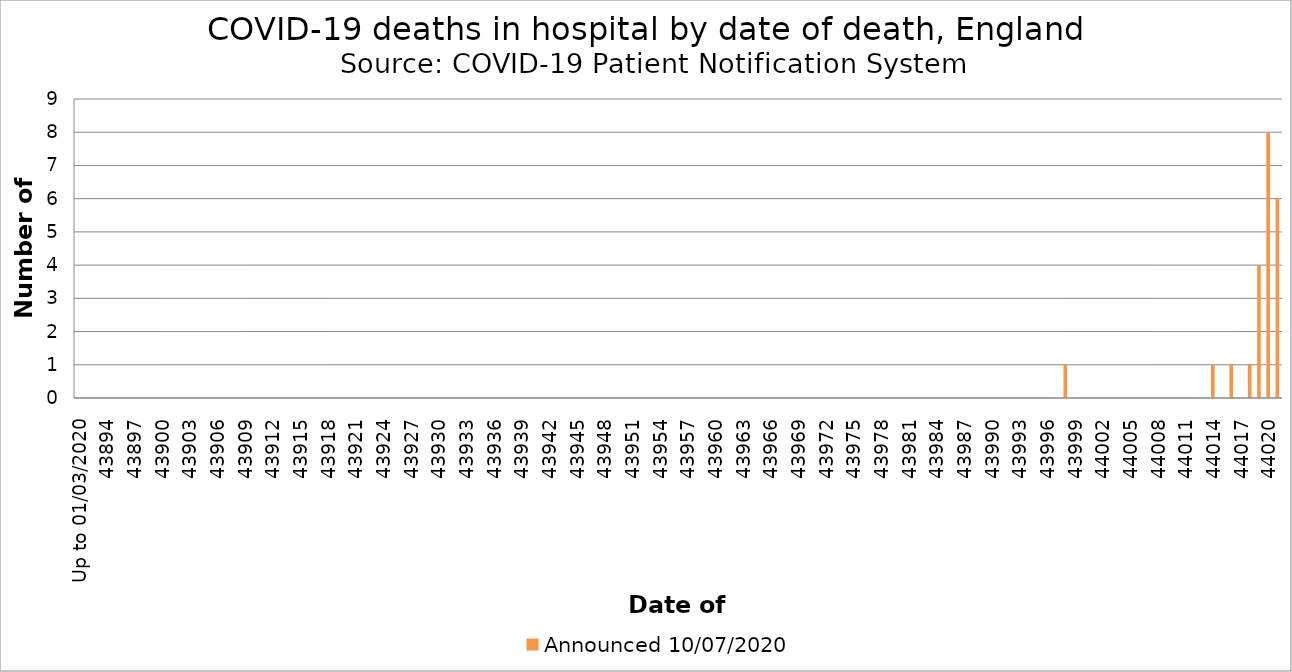
| Category | Announced 10/07/2020 |
|---|---|
| Up to 01/03/2020 | 0 |
| 02/03/2020 | 0 |
| 03/03/2020 | 0 |
| 04/03/2020 | 0 |
| 05/03/2020 | 0 |
| 06/03/2020 | 0 |
| 07/03/2020 | 0 |
| 08/03/2020 | 0 |
| 09/03/2020 | 0 |
| 10/03/2020 | 0 |
| 11/03/2020 | 0 |
| 12/03/2020 | 0 |
| 13/03/2020 | 0 |
| 14/03/2020 | 0 |
| 15/03/2020 | 0 |
| 16/03/2020 | 0 |
| 17/03/2020 | 0 |
| 18/03/2020 | 0 |
| 19/03/2020 | 0 |
| 20/03/2020 | 0 |
| 21/03/2020 | 0 |
| 22/03/2020 | 0 |
| 23/03/2020 | 0 |
| 24/03/2020 | 0 |
| 25/03/2020 | 0 |
| 26/03/2020 | 0 |
| 27/03/2020 | 0 |
| 28/03/2020 | 0 |
| 29/03/2020 | 0 |
| 30/03/2020 | 0 |
| 31/03/2020 | 0 |
| 01/04/2020 | 0 |
| 02/04/2020 | 0 |
| 03/04/2020 | 0 |
| 04/04/2020 | 0 |
| 05/04/2020 | 0 |
| 06/04/2020 | 0 |
| 07/04/2020 | 0 |
| 08/04/2020 | 0 |
| 09/04/2020 | 0 |
| 10/04/2020 | 0 |
| 11/04/2020 | 0 |
| 12/04/2020 | 0 |
| 13/04/2020 | 0 |
| 14/04/2020 | 0 |
| 15/04/2020 | 0 |
| 16/04/2020 | 0 |
| 17/04/2020 | 0 |
| 18/04/2020 | 0 |
| 19/04/2020 | 0 |
| 20/04/2020 | 0 |
| 21/04/2020 | 0 |
| 22/04/2020 | 0 |
| 23/04/2020 | 0 |
| 24/04/2020 | 0 |
| 25/04/2020 | 0 |
| 26/04/2020 | 0 |
| 27/04/2020 | 0 |
| 28/04/2020 | 0 |
| 29/04/2020 | 0 |
| 30/04/2020 | 0 |
| 01/05/2020 | 0 |
| 02/05/2020 | 0 |
| 03/05/2020 | 0 |
| 04/05/2020 | 0 |
| 05/05/2020 | 0 |
| 06/05/2020 | 0 |
| 07/05/2020 | 0 |
| 08/05/2020 | 0 |
| 09/05/2020 | 0 |
| 10/05/2020 | 0 |
| 11/05/2020 | 0 |
| 12/05/2020 | 0 |
| 13/05/2020 | 0 |
| 14/05/2020 | 0 |
| 15/05/2020 | 0 |
| 16/05/2020 | 0 |
| 17/05/2020 | 0 |
| 18/05/2020 | 0 |
| 19/05/2020 | 0 |
| 20/05/2020 | 0 |
| 21/05/2020 | 0 |
| 22/05/2020 | 0 |
| 23/05/2020 | 0 |
| 24/05/2020 | 0 |
| 25/05/2020 | 0 |
| 26/05/2020 | 0 |
| 27/05/2020 | 0 |
| 28/05/2020 | 0 |
| 29/05/2020 | 0 |
| 30/05/2020 | 0 |
| 31/05/2020 | 0 |
| 01/06/2020 | 0 |
| 02/06/2020 | 0 |
| 03/06/2020 | 0 |
| 04/06/2020 | 0 |
| 05/06/2020 | 0 |
| 06/06/2020 | 0 |
| 07/06/2020 | 0 |
| 08/06/2020 | 0 |
| 09/06/2020 | 0 |
| 10/06/2020 | 0 |
| 11/06/2020 | 0 |
| 12/06/2020 | 0 |
| 13/06/2020 | 0 |
| 14/06/2020 | 0 |
| 15/06/2020 | 0 |
| 16/06/2020 | 1 |
| 17/06/2020 | 0 |
| 18/06/2020 | 0 |
| 19/06/2020 | 0 |
| 20/06/2020 | 0 |
| 21/06/2020 | 0 |
| 22/06/2020 | 0 |
| 23/06/2020 | 0 |
| 24/06/2020 | 0 |
| 25/06/2020 | 0 |
| 26/06/2020 | 0 |
| 27/06/2020 | 0 |
| 28/06/2020 | 0 |
| 29/06/2020 | 0 |
| 30/06/2020 | 0 |
| 01/07/2020 | 0 |
| 02/07/2020 | 1 |
| 03/07/2020 | 0 |
| 04/07/2020 | 1 |
| 05/07/2020 | 0 |
| 06/07/2020 | 1 |
| 07/07/2020 | 4 |
| 08/07/2020 | 8 |
| 09/07/2020 | 6 |